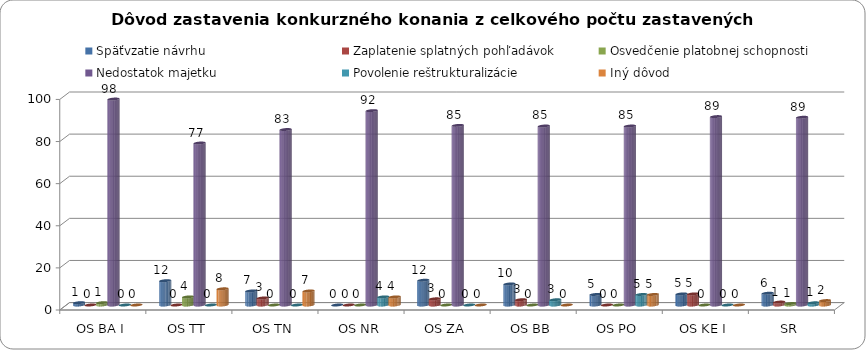
| Category | Späťvzatie návrhu | Zaplatenie splatných pohľadávok | Osvedčenie platobnej schopnosti | Nedostatok majetku | Povolenie reštrukturalizácie | Iný dôvod |
|---|---|---|---|---|---|---|
| OS BA I | 1.099 | 0 | 1.099 | 97.802 | 0 | 0 |
| OS TT | 11.538 | 0 | 3.846 | 76.923 | 0 | 7.692 |
| OS TN | 6.667 | 3.333 | 0 | 83.333 | 0 | 6.667 |
| OS NR | 0 | 0 | 0 | 92.308 | 3.846 | 3.846 |
| OS ZA | 11.765 | 2.941 | 0 | 85.294 | 0 | 0 |
| OS BB | 10 | 2.5 | 0 | 85 | 2.5 | 0 |
| OS PO | 5 | 0 | 0 | 85 | 5 | 5 |
| OS KE I | 5.263 | 5.263 | 0 | 89.474 | 0 | 0 |
| SR | 5.594 | 1.399 | 0.699 | 89.161 | 1.049 | 2.098 |